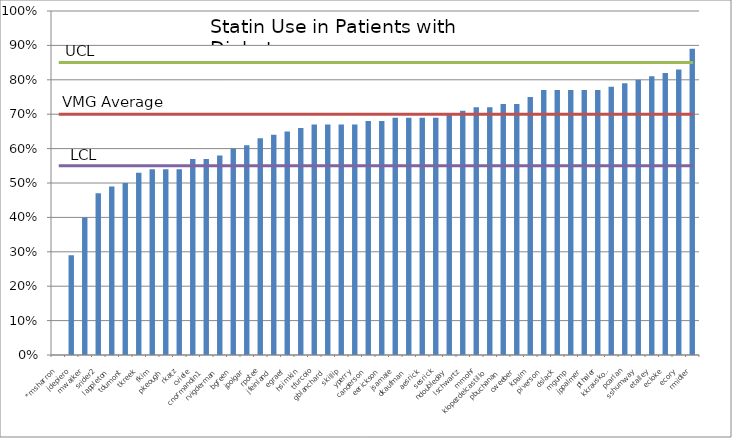
| Category | Series 0 |
|---|---|
| *msharron | 0 |
| jdepiero | 0.29 |
| mwalker | 0.4 |
| srider2 | 0.47 |
| lappleton | 0.49 |
| tdumont | 0.5 |
| tkreek | 0.53 |
| fkim | 0.54 |
| pkeough | 0.54 |
| rkatz | 0.54 |
| cviele | 0.57 |
| cnormandin1 | 0.57 |
| rvigderman | 0.58 |
| bgreen | 0.6 |
| jpolgar | 0.61 |
| rpotee | 0.63 |
| jfeinland | 0.64 |
| egraef | 0.65 |
| hsimkin | 0.66 |
| tfurcolo | 0.67 |
| gblanchard | 0.67 |
| skillip | 0.67 |
| yperry | 0.67 |
| canderson | 0.68 |
| eerickson | 0.68 |
| jsamale | 0.69 |
| dkaufman | 0.69 |
| aesrick | 0.69 |
| sesrick | 0.69 |
| ndoubleday | 0.7 |
| lschwartz | 0.71 |
| mmohr | 0.72 |
| klopezdelcastillo | 0.72 |
| pbuchanan | 0.73 |
| cweeber | 0.73 |
| kpalm | 0.75 |
| piverson | 0.77 |
| dslack | 0.77 |
| mgump | 0.77 |
| jppalmer | 0.77 |
| pthaler | 0.77 |
| kkrauskopf | 0.78 |
| pcarlan | 0.79 |
| sshumway | 0.8 |
| etalley | 0.81 |
| ecloke | 0.82 |
| ecory | 0.83 |
| rmidler | 0.89 |